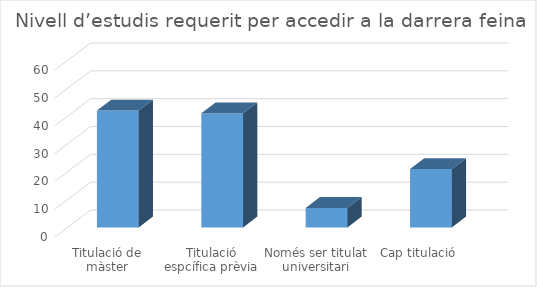
| Category | Series 0 |
|---|---|
| Titulació de màster | 42 |
| Titulació espcífica prèvia | 41 |
| Només ser titulat universitari | 7 |
| Cap titulació | 21 |